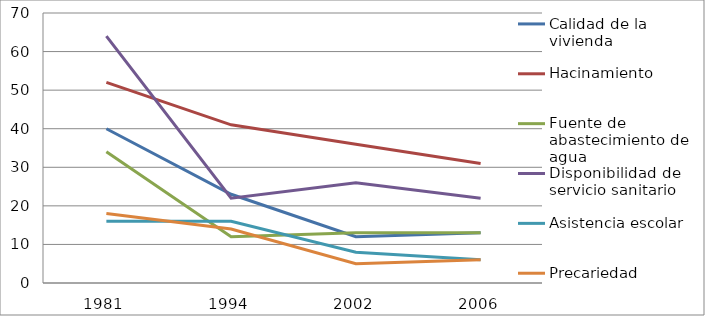
| Category | Calidad de la vivienda | Hacinamiento | Fuente de abastecimiento de agua | Disponibilidad de servicio sanitario | Asistencia escolar | Precariedad ocupacional |
|---|---|---|---|---|---|---|
| 1981.0 | 40 | 52 | 34 | 64 | 16 | 18 |
| 1994.0 | 23 | 41 | 12 | 22 | 16 | 14 |
| 2002.0 | 12 | 36 | 13 | 26 | 8 | 5 |
| 2006.0 | 13 | 31 | 13 | 22 | 6 | 6 |